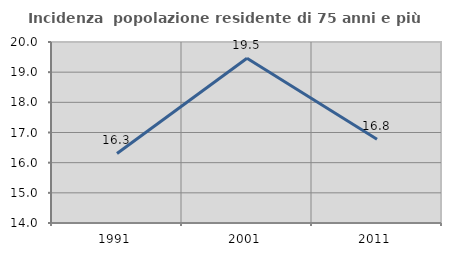
| Category | Incidenza  popolazione residente di 75 anni e più |
|---|---|
| 1991.0 | 16.305 |
| 2001.0 | 19.461 |
| 2011.0 | 16.777 |